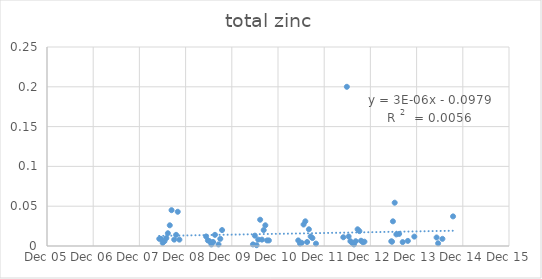
| Category | Series 0 |
|---|---|
| 39577.0 | 0.009 |
| 39590.0 | 0.009 |
| 39604.0 | 0.004 |
| 39618.0 | 0.006 |
| 39633.0 | 0.01 |
| 39645.0 | 0.016 |
| 39660.0 | 0.026 |
| 39674.0 | 0.045 |
| 39695.0 | 0.008 |
| 39710.0 | 0.014 |
| 39723.0 | 0.043 |
| 39736.0 | 0.008 |
| 39947.0 | 0.012 |
| 39961.0 | 0.007 |
| 39974.0 | 0.006 |
| 39989.0 | 0.002 |
| 40002.0 | 0.005 |
| 40017.0 | 0.014 |
| 40045.0 | 0.002 |
| 40059.0 | 0.009 |
| 40073.0 | 0.02 |
| 40317.0 | 0.002 |
| 40332.0 | 0.013 |
| 40346.0 | 0.001 |
| 40359.0 | 0.008 |
| 40374.0 | 0.033 |
| 40388.0 | 0.008 |
| 40402.0 | 0.02 |
| 40415.0 | 0.026 |
| 40429.0 | 0.007 |
| 40443.0 | 0.007 |
| 40675.0 | 0.007 |
| 40689.0 | 0.003 |
| 40702.0 | 0.004 |
| 40717.0 | 0.027 |
| 40731.0 | 0.031 |
| 40745.0 | 0.005 |
| 40759.0 | 0.021 |
| 40773.0 | 0.012 |
| 40787.0 | 0.01 |
| 40815.0 | 0.003 |
| 41031.0 | 0.011 |
| 41059.0 | 0.2 |
| 41073.0 | 0.012 |
| 41087.0 | 0.006 |
| 41101.0 | 0.004 |
| 41115.0 | 0.002 |
| 41129.0 | 0.006 |
| 41144.0 | 0.021 |
| 41158.0 | 0.019 |
| 41171.0 | 0.007 |
| 41186.0 | 0.005 |
| 41198.0 | 0.005 |
| 41410.0 | 0.006 |
| 41416.0 | 0.005 |
| 41423.0 | 0.031 |
| 41437.0 | 0.054 |
| 41450.0 | 0.015 |
| 41472.0 | 0.015 |
| 41500.0 | 0.005 |
| 41541.0 | 0.006 |
| 41592.0 | 0.012 |
| 41768.0 | 0.011 |
| 41780.0 | 0.003 |
| 41814.0 | 0.009 |
| 41898.0 | 0.037 |